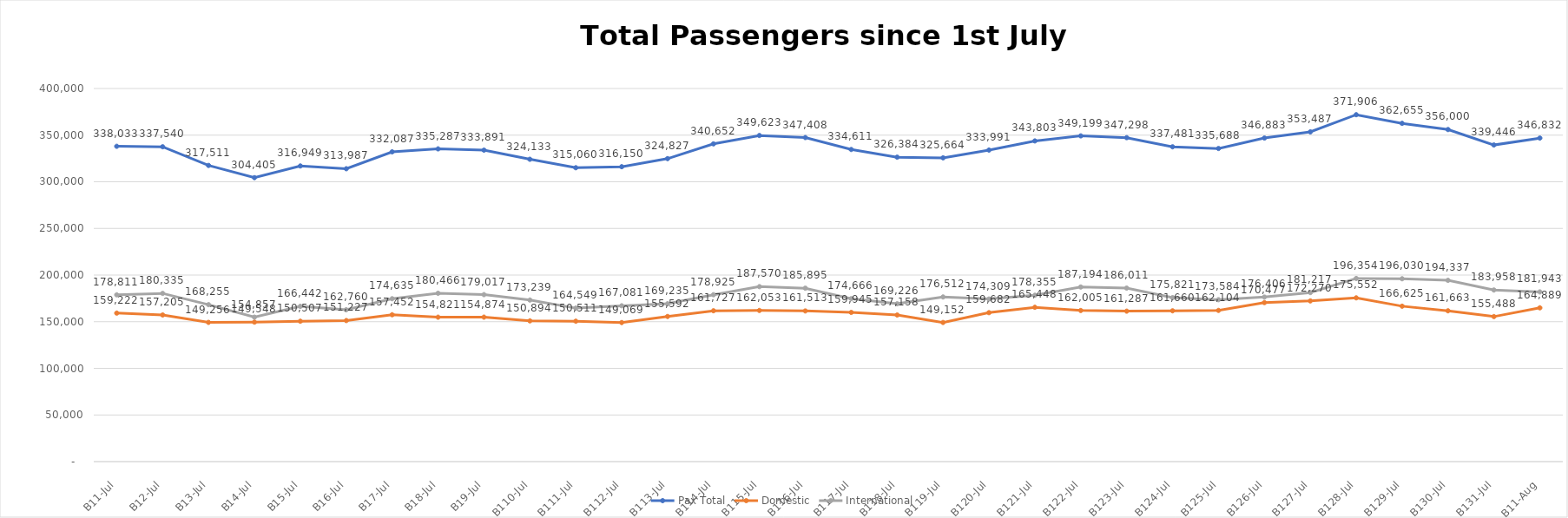
| Category | Pax Total |  Domestic  |  International  |
|---|---|---|---|
| 2023-07-01 | 338033 | 159222 | 178811 |
| 2023-07-02 | 337540 | 157205 | 180335 |
| 2023-07-03 | 317511 | 149256 | 168255 |
| 2023-07-04 | 304405 | 149548 | 154857 |
| 2023-07-05 | 316949 | 150507 | 166442 |
| 2023-07-06 | 313987 | 151227 | 162760 |
| 2023-07-07 | 332087 | 157452 | 174635 |
| 2023-07-08 | 335287 | 154821 | 180466 |
| 2023-07-09 | 333891 | 154874 | 179017 |
| 2023-07-10 | 324133 | 150894 | 173239 |
| 2023-07-11 | 315060 | 150511 | 164549 |
| 2023-07-12 | 316150 | 149069 | 167081 |
| 2023-07-13 | 324827 | 155592 | 169235 |
| 2023-07-14 | 340652 | 161727 | 178925 |
| 2023-07-15 | 349623 | 162053 | 187570 |
| 2023-07-16 | 347408 | 161513 | 185895 |
| 2023-07-17 | 334611 | 159945 | 174666 |
| 2023-07-18 | 326384 | 157158 | 169226 |
| 2023-07-19 | 325664 | 149152 | 176512 |
| 2023-07-20 | 333991 | 159682 | 174309 |
| 2023-07-21 | 343803 | 165448 | 178355 |
| 2023-07-22 | 349199 | 162005 | 187194 |
| 2023-07-23 | 347298 | 161287 | 186011 |
| 2023-07-24 | 337481 | 161660 | 175821 |
| 2023-07-25 | 335688 | 162104 | 173584 |
| 2023-07-26 | 346883 | 170477 | 176406 |
| 2023-07-27 | 353487 | 172270 | 181217 |
| 2023-07-28 | 371906 | 175552 | 196354 |
| 2023-07-29 | 362655 | 166625 | 196030 |
| 2023-07-30 | 356000 | 161663 | 194337 |
| 2023-07-31 | 339446 | 155488 | 183958 |
| 2023-08-01 | 346832 | 164889 | 181943 |